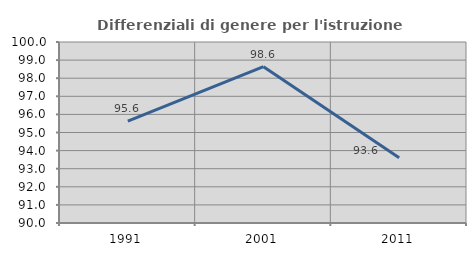
| Category | Differenziali di genere per l'istruzione superiore |
|---|---|
| 1991.0 | 95.629 |
| 2001.0 | 98.637 |
| 2011.0 | 93.603 |